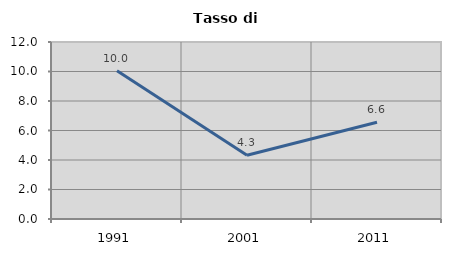
| Category | Tasso di disoccupazione   |
|---|---|
| 1991.0 | 10.048 |
| 2001.0 | 4.321 |
| 2011.0 | 6.561 |